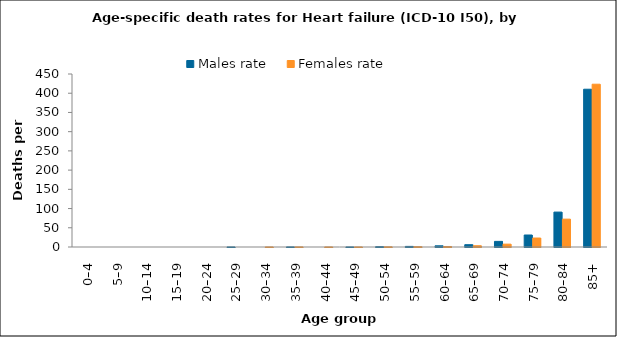
| Category | Males rate | Females rate |
|---|---|---|
| 0–4 | 0 | 0 |
| 5–9 | 0 | 0 |
| 10–14 | 0 | 0 |
| 15–19 | 0 | 0 |
| 20–24 | 0 | 0 |
| 25–29 | 0.109 | 0 |
| 30–34 | 0 | 0.104 |
| 35–39 | 0.215 | 0.213 |
| 40–44 | 0 | 0.119 |
| 45–49 | 0.122 | 0.12 |
| 50–54 | 0.881 | 0.489 |
| 55–59 | 1.574 | 0.888 |
| 60–64 | 3.093 | 1.327 |
| 65–69 | 5.992 | 3.32 |
| 70–74 | 14.603 | 7.431 |
| 75–79 | 31.198 | 23.369 |
| 80–84 | 90.814 | 72.433 |
| 85+ | 410.407 | 423.423 |